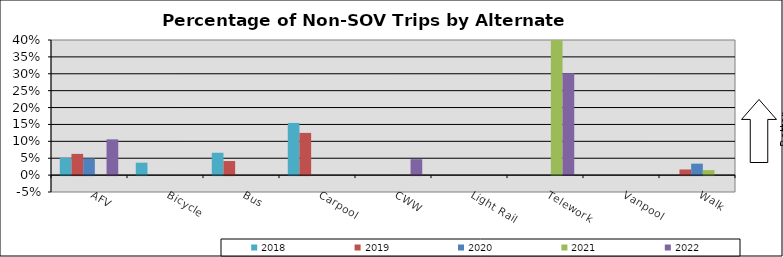
| Category | 2018 | 2019 | 2020 | 2021 | 2022 |
|---|---|---|---|---|---|
| AFV | 0.051 | 0.063 | 0.049 | 0 | 0.106 |
| Bicycle | 0.037 | 0 | 0 | 0 | 0 |
| Bus | 0.066 | 0.042 | 0 | 0 | 0 |
| Carpool | 0.154 | 0.125 | 0 | 0 | 0 |
| CWW | 0 | 0 | 0 | 0 | 0.047 |
| Light Rail | 0 | 0 | 0 | 0 | 0 |
| Telework | 0 | 0 | 0 | 0.919 | 0.302 |
| Vanpool | 0 | 0 | 0 | 0 | 0 |
| Walk | 0 | 0.017 | 0.034 | 0.015 | 0 |